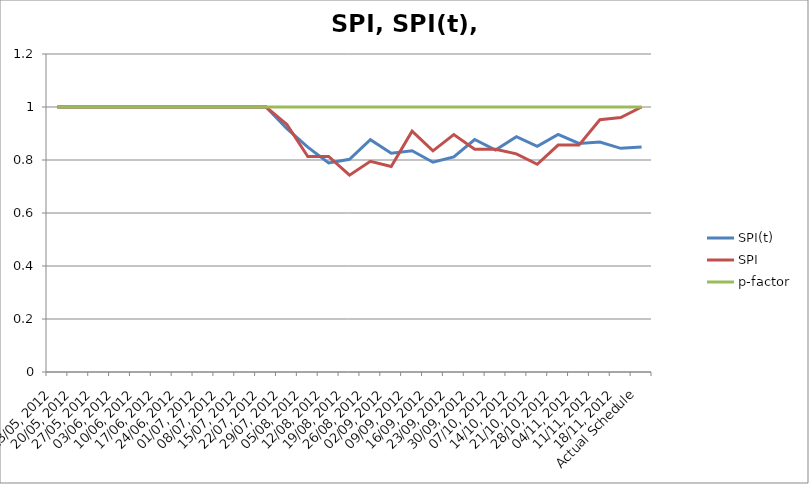
| Category | SPI(t) | SPI | p-factor |
|---|---|---|---|
| 13/05, 2012 | 1 | 1 | 1 |
| 20/05, 2012 | 1 | 1 | 1 |
| 27/05, 2012 | 1 | 1 | 1 |
| 03/06, 2012 | 1 | 1 | 1 |
| 10/06, 2012 | 1 | 1 | 1 |
| 17/06, 2012 | 1 | 1 | 1 |
| 24/06, 2012 | 1 | 1 | 1 |
| 01/07, 2012 | 1 | 1 | 1 |
| 08/07, 2012 | 1 | 1 | 1 |
| 15/07, 2012 | 1 | 1 | 1 |
| 22/07, 2012 | 1 | 1 | 1 |
| 29/07, 2012 | 0.918 | 0.934 | 1 |
| 05/08, 2012 | 0.848 | 0.813 | 1 |
| 12/08, 2012 | 0.789 | 0.813 | 1 |
| 19/08, 2012 | 0.803 | 0.743 | 1 |
| 26/08, 2012 | 0.877 | 0.795 | 1 |
| 02/09, 2012 | 0.826 | 0.775 | 1 |
| 09/09, 2012 | 0.835 | 0.909 | 1 |
| 16/09, 2012 | 0.792 | 0.835 | 1 |
| 23/09, 2012 | 0.812 | 0.896 | 1 |
| 30/09, 2012 | 0.877 | 0.841 | 1 |
| 07/10, 2012 | 0.838 | 0.841 | 1 |
| 14/10, 2012 | 0.888 | 0.823 | 1 |
| 21/10, 2012 | 0.851 | 0.784 | 1 |
| 28/10, 2012 | 0.897 | 0.856 | 1 |
| 04/11, 2012 | 0.863 | 0.856 | 1 |
| 11/11, 2012 | 0.868 | 0.952 | 1 |
| 18/11, 2012 | 0.844 | 0.96 | 1 |
| Actual Schedule | 0.849 | 1 | 1 |